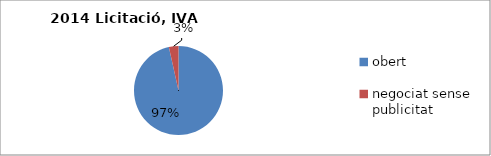
| Category | Series 0 |
|---|---|
| obert | 9176830.51 |
| negociat sense publicitat  | 330700 |